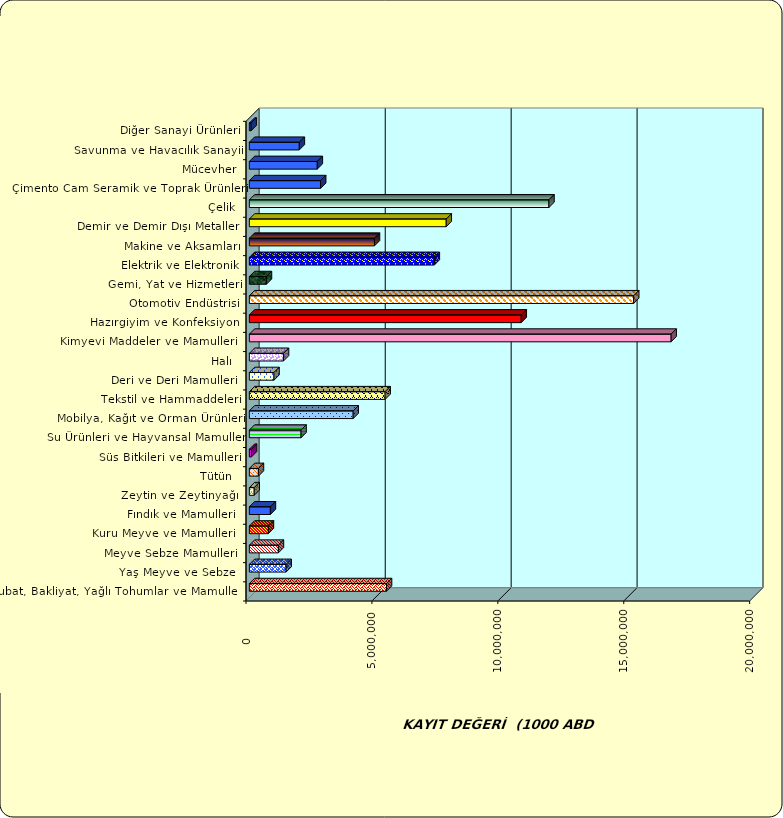
| Category | Series 0 |
|---|---|
|  Hububat, Bakliyat, Yağlı Tohumlar ve Mamulleri  | 5446213.821 |
|  Yaş Meyve ve Sebze   | 1459677.208 |
|  Meyve Sebze Mamulleri  | 1153100.632 |
|  Kuru Meyve ve Mamulleri   | 755879.72 |
|  Fındık ve Mamulleri  | 835097.371 |
|  Zeytin ve Zeytinyağı  | 193055.886 |
|  Tütün  | 359555.441 |
|  Süs Bitkileri ve Mamulleri | 84750.59 |
|  Su Ürünleri ve Hayvansal Mamuller | 2052904.101 |
|  Mobilya, Kağıt ve Orman Ürünleri | 4122690.765 |
|  Tekstil ve Hammaddeleri | 5391857.74 |
|  Deri ve Deri Mamulleri  | 978607.691 |
|  Halı  | 1355420.429 |
|  Kimyevi Maddeler ve Mamulleri   | 16748425.252 |
|  Hazırgiyim ve Konfeksiyon  | 10795596.769 |
|  Otomotiv Endüstrisi | 15261231.939 |
|  Gemi, Yat ve Hizmetleri | 678217.224 |
|  Elektrik ve Elektronik | 7343975.697 |
|  Makine ve Aksamları | 4968057.232 |
|  Demir ve Demir Dışı Metaller  | 7817261.785 |
|  Çelik | 11896091.847 |
|  Çimento Cam Seramik ve Toprak Ürünleri | 2830602.865 |
|  Mücevher | 2697965.297 |
|  Savunma ve Havacılık Sanayii | 1984194.789 |
|  Diğer Sanayi Ürünleri | 68669.681 |